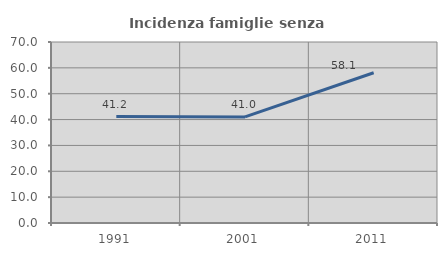
| Category | Incidenza famiglie senza nuclei |
|---|---|
| 1991.0 | 41.176 |
| 2001.0 | 41.026 |
| 2011.0 | 58.108 |